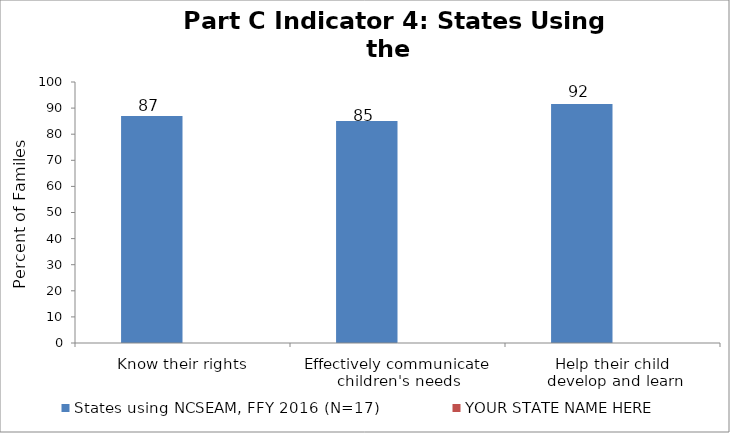
| Category | States using NCSEAM, FFY 2016 (N=17) | YOUR STATE NAME HERE |
|---|---|---|
| Know their rights | 86.944 |  |
| Effectively communicate 
children's needs | 85.093 |  |
| Help their child 
develop and learn | 91.609 |  |